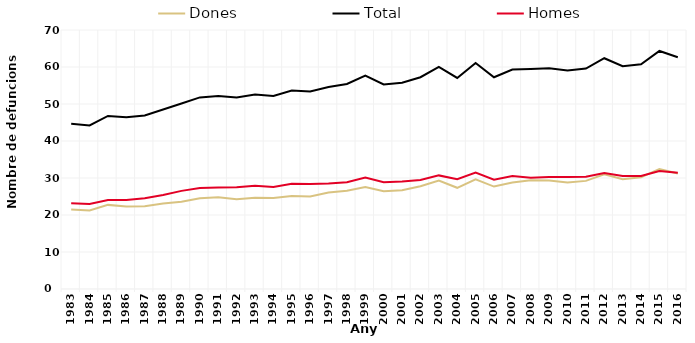
| Category | Dones | Total | Homes |
|---|---|---|---|
| 1983.0 | 21491 | 44691 | 23200 |
| 1984.0 | 21241 | 44206 | 22965 |
| 1985.0 | 22734 | 46773 | 24039 |
| 1986.0 | 22323 | 46406 | 24083 |
| 1987.0 | 22387 | 46901 | 24514 |
| 1988.0 | 23100 | 48527 | 25427 |
| 1989.0 | 23610 | 50129 | 26519 |
| 1990.0 | 24509 | 51777 | 27268 |
| 1991.0 | 24789 | 52190 | 27401 |
| 1992.0 | 24288 | 51771 | 27483 |
| 1993.0 | 24637 | 52570 | 27931 |
| 1994.0 | 24598 | 52191 | 27593 |
| 1995.0 | 25155 | 53628 | 28473 |
| 1996.0 | 25016 | 53362 | 28346 |
| 1997.0 | 26069 | 54592 | 28523 |
| 1998.0 | 26545 | 55414 | 28869 |
| 1999.0 | 27562 | 57676 | 30114 |
| 2000.0 | 26447 | 55279 | 28832 |
| 2001.0 | 26682 | 55741 | 29059 |
| 2002.0 | 27772 | 57234 | 29462 |
| 2003.0 | 29334 | 60037 | 30703 |
| 2004.0 | 27354 | 57051 | 29697 |
| 2005.0 | 29651 | 61106 | 31455 |
| 2006.0 | 27683 | 57227 | 29544 |
| 2007.0 | 28780 | 59312 | 30532 |
| 2008.0 | 29375 | 59474 | 30099 |
| 2009.0 | 29340 | 59631 | 30291 |
| 2010.0 | 28797 | 59057 | 30260 |
| 2011.0 | 29223 | 59576 | 30353 |
| 2012.0 | 31022 | 62373 | 31351 |
| 2013.0 | 29679 | 60210 | 30531 |
| 2014.0 | 30196 | 60730 | 30534 |
| 2015.0 | 32443 | 64336 | 31893 |
| 2016.0 | 31236 | 62649 | 31413 |